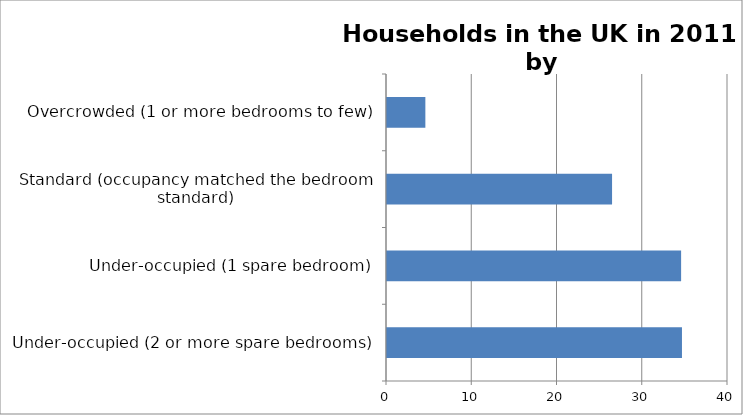
| Category | Series 0 |
|---|---|
| Under-occupied (2 or more spare bedrooms) | 34.6 |
| Under-occupied (1 spare bedroom) | 34.5 |
| Standard (occupancy matched the bedroom standard) | 26.4 |
| Overcrowded (1 or more bedrooms to few) | 4.5 |